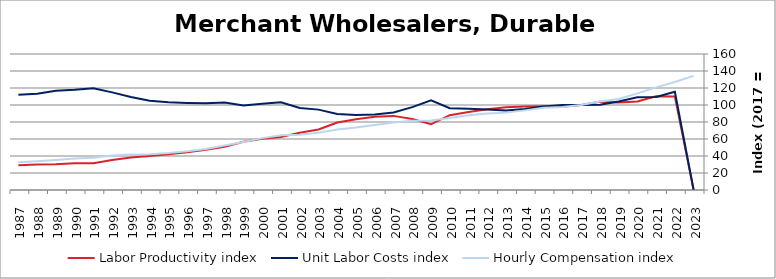
| Category | Labor Productivity index | Unit Labor Costs index | Hourly Compensation index |
|---|---|---|---|
| 2023.0 | 0 | 0 | 134.235 |
| 2022.0 | 109.943 | 115.49 | 126.973 |
| 2021.0 | 110.31 | 109.43 | 120.712 |
| 2020.0 | 104.214 | 109.097 | 113.694 |
| 2019.0 | 102.897 | 104.071 | 107.085 |
| 2018.0 | 103.875 | 100.336 | 104.224 |
| 2017.0 | 100 | 100 | 100 |
| 2016.0 | 97.817 | 99.933 | 97.751 |
| 2015.0 | 98.444 | 98.274 | 96.744 |
| 2014.0 | 98.167 | 95.434 | 93.685 |
| 2013.0 | 97.332 | 93.524 | 91.028 |
| 2012.0 | 95.09 | 94.763 | 90.111 |
| 2011.0 | 91.853 | 95.699 | 87.902 |
| 2010.0 | 87.996 | 96.295 | 84.736 |
| 2009.0 | 77.309 | 105.6 | 81.639 |
| 2008.0 | 83.539 | 97.507 | 81.457 |
| 2007.0 | 87.193 | 91.193 | 79.514 |
| 2006.0 | 86.131 | 88.842 | 76.521 |
| 2005.0 | 83.108 | 88.329 | 73.409 |
| 2004.0 | 79.381 | 89.544 | 71.081 |
| 2003.0 | 71.239 | 94.556 | 67.36 |
| 2002.0 | 67.405 | 96.488 | 65.037 |
| 2001.0 | 62.257 | 103.239 | 64.273 |
| 2000.0 | 60.2 | 101.4 | 61.043 |
| 1999.0 | 56.85 | 99.428 | 56.525 |
| 1998.0 | 50.903 | 102.894 | 52.376 |
| 1997.0 | 47.357 | 101.913 | 48.263 |
| 1996.0 | 44.49 | 102.431 | 45.571 |
| 1995.0 | 42.194 | 103.199 | 43.544 |
| 1994.0 | 40.036 | 104.97 | 42.026 |
| 1993.0 | 38.174 | 109.491 | 41.797 |
| 1992.0 | 35.345 | 114.859 | 40.597 |
| 1991.0 | 31.607 | 119.661 | 37.821 |
| 1990.0 | 31.521 | 117.887 | 37.16 |
| 1989.0 | 30.321 | 116.767 | 35.405 |
| 1988.0 | 29.954 | 113.111 | 33.881 |
| 1987.0 | 29.057 | 112.063 | 32.563 |